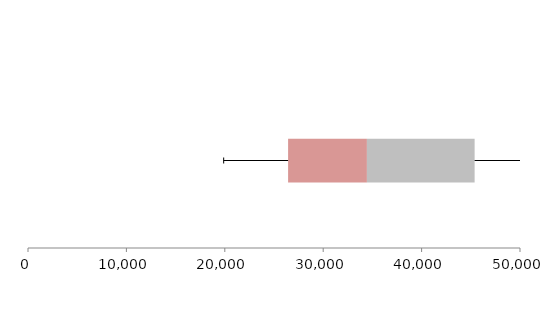
| Category | Series 1 | Series 2 | Series 3 |
|---|---|---|---|
| 0 | 26432.58 | 8010.396 | 10946.165 |